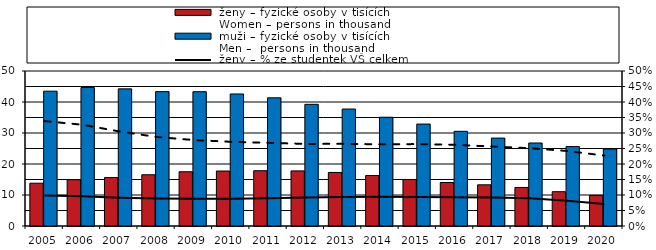
| Category |  ženy – fyzické osoby v tisících
 Women – persons in thousand |  muži – fyzické osoby v tisících
 Men –  persons in thousand |
|---|---|---|
| 2005.0 | 13.808 | 43.496 |
| 2006.0 | 14.933 | 44.665 |
| 2007.0 | 15.634 | 44.236 |
| 2008.0 | 16.533 | 43.348 |
| 2009.0 | 17.505 | 43.325 |
| 2010.0 | 17.735 | 42.59 |
| 2011.0 | 17.831 | 41.349 |
| 2012.0 | 17.775 | 39.251 |
| 2013.0 | 17.271 | 37.734 |
| 2014.0 | 16.291 | 35.089 |
| 2015.0 | 15.006 | 32.881 |
| 2016.0 | 14.033 | 30.543 |
| 2017.0 | 13.29 | 28.357 |
| 2018.0 | 12.426 | 26.776 |
| 2019.0 | 11.067 | 25.613 |
| 2020.0 | 9.886 | 24.841 |